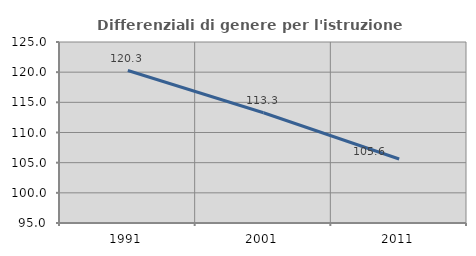
| Category | Differenziali di genere per l'istruzione superiore |
|---|---|
| 1991.0 | 120.273 |
| 2001.0 | 113.28 |
| 2011.0 | 105.613 |